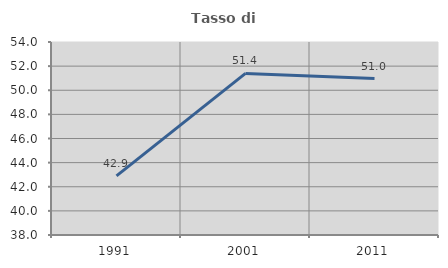
| Category | Tasso di occupazione   |
|---|---|
| 1991.0 | 42.903 |
| 2001.0 | 51.397 |
| 2011.0 | 50.973 |